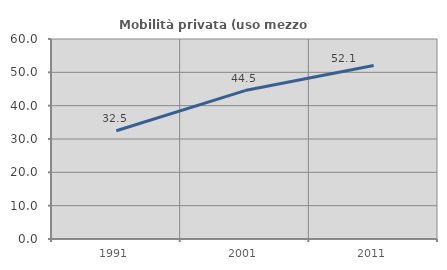
| Category | Mobilità privata (uso mezzo privato) |
|---|---|
| 1991.0 | 32.486 |
| 2001.0 | 44.526 |
| 2011.0 | 52.077 |